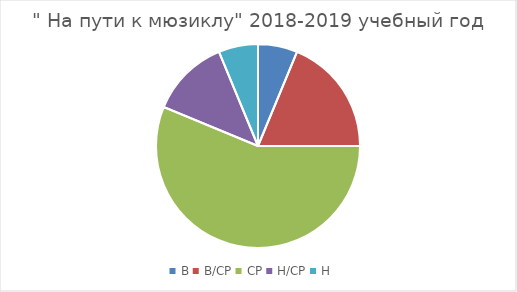
| Category | декабрь | май |
|---|---|---|
| В | 1 | 3 |
| В/СР | 3 | 5 |
| СР | 9 | 7 |
| Н/СР | 2 | 0 |
| Н | 1 | 0 |